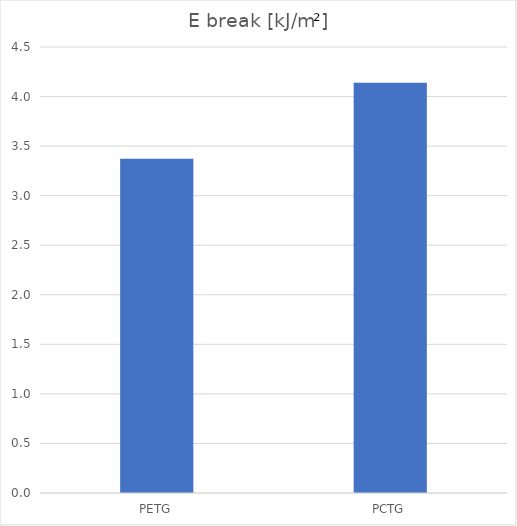
| Category | E [kJ/m²] |
|---|---|
| PETG | 3.372 |
| PCTG | 4.139 |